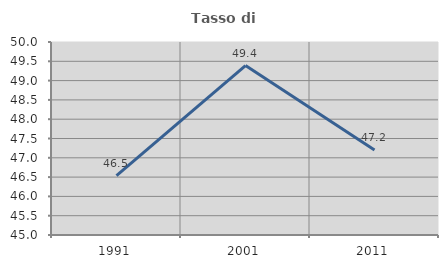
| Category | Tasso di occupazione   |
|---|---|
| 1991.0 | 46.536 |
| 2001.0 | 49.388 |
| 2011.0 | 47.202 |